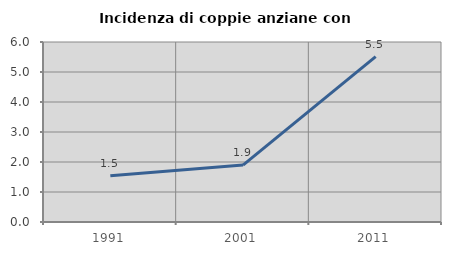
| Category | Incidenza di coppie anziane con figli |
|---|---|
| 1991.0 | 1.542 |
| 2001.0 | 1.897 |
| 2011.0 | 5.51 |